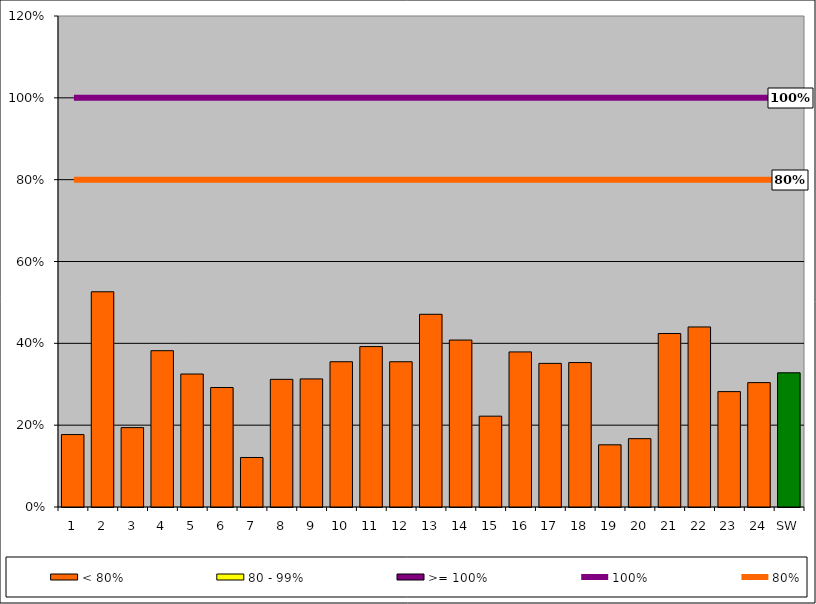
| Category | < 80% | 80 - 99% | >= 100% |
|---|---|---|---|
| 1 | 0.177 | 0 | 0 |
| 2 | 0.526 | 0 | 0 |
| 3 | 0.194 | 0 | 0 |
| 4 | 0.382 | 0 | 0 |
| 5 | 0.325 | 0 | 0 |
| 6 | 0.292 | 0 | 0 |
| 7 | 0.121 | 0 | 0 |
| 8 | 0.312 | 0 | 0 |
| 9 | 0.313 | 0 | 0 |
| 10 | 0.355 | 0 | 0 |
| 11 | 0.392 | 0 | 0 |
| 12 | 0.355 | 0 | 0 |
| 13 | 0.471 | 0 | 0 |
| 14 | 0.408 | 0 | 0 |
| 15 | 0.222 | 0 | 0 |
| 16 | 0.379 | 0 | 0 |
| 17 | 0.351 | 0 | 0 |
| 18 | 0.353 | 0 | 0 |
| 19 | 0.152 | 0 | 0 |
| 20 | 0.167 | 0 | 0 |
| 21 | 0.424 | 0 | 0 |
| 22 | 0.44 | 0 | 0 |
| 23 | 0.282 | 0 | 0 |
| 24 | 0.304 | 0 | 0 |
| SW | 0.328 | 0 | 0 |